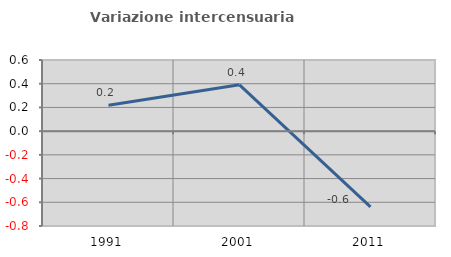
| Category | Variazione intercensuaria annua |
|---|---|
| 1991.0 | 0.218 |
| 2001.0 | 0.39 |
| 2011.0 | -0.639 |